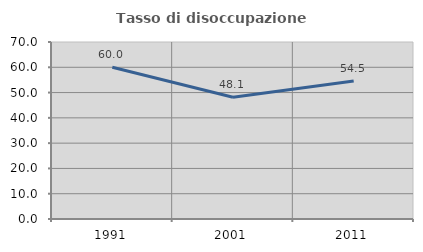
| Category | Tasso di disoccupazione giovanile  |
|---|---|
| 1991.0 | 60 |
| 2001.0 | 48.148 |
| 2011.0 | 54.545 |